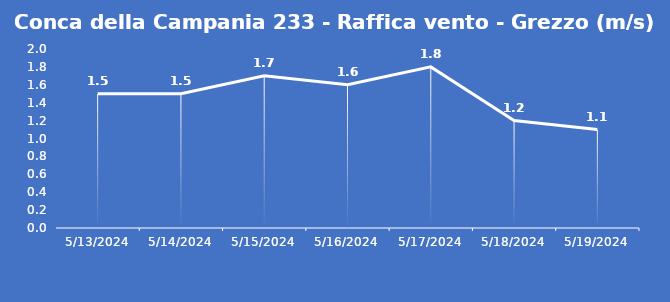
| Category | Conca della Campania 233 - Raffica vento - Grezzo (m/s) |
|---|---|
| 5/13/24 | 1.5 |
| 5/14/24 | 1.5 |
| 5/15/24 | 1.7 |
| 5/16/24 | 1.6 |
| 5/17/24 | 1.8 |
| 5/18/24 | 1.2 |
| 5/19/24 | 1.1 |